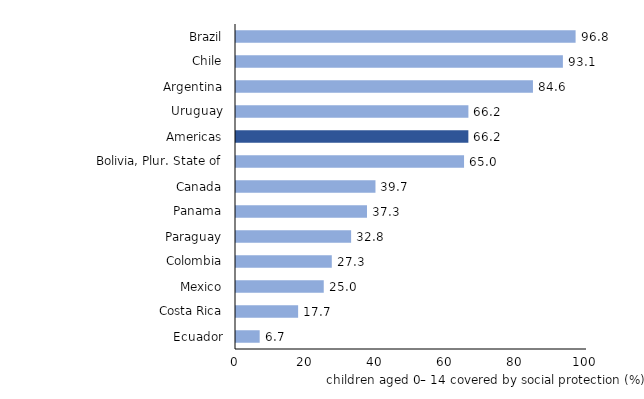
| Category | Children covered by SP, % of children 0-14 |
|---|---|
| Ecuador | 6.746 |
| Costa Rica | 17.7 |
| Mexico | 25 |
| Colombia | 27.292 |
| Paraguay | 32.796 |
| Panama | 37.319 |
| Canada | 39.735 |
| Bolivia, Plur. State of | 64.971 |
| Americas | 66.2 |
| Uruguay | 66.21 |
| Argentina | 84.6 |
| Chile | 93.131 |
| Brazil | 96.751 |